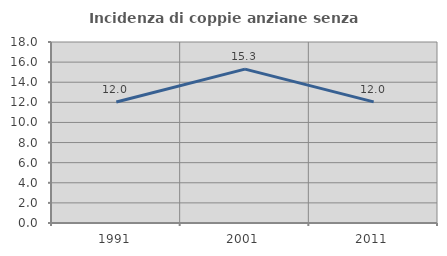
| Category | Incidenza di coppie anziane senza figli  |
|---|---|
| 1991.0 | 12.037 |
| 2001.0 | 15.306 |
| 2011.0 | 12.048 |